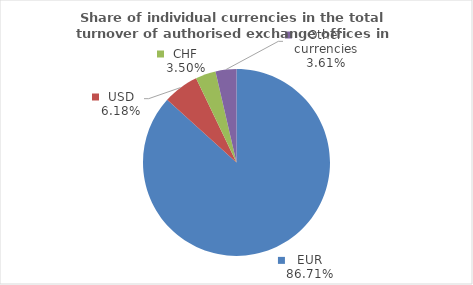
| Category | Series 0 |
|---|---|
| EUR | 86.707 |
| USD | 6.178 |
| CHF | 3.505 |
| Other currencies | 3.61 |